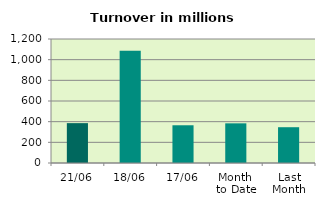
| Category | Series 0 |
|---|---|
| 21/06 | 385.791 |
| 18/06 | 1086.988 |
| 17/06 | 365.173 |
| Month 
to Date | 383.859 |
| Last
Month | 346.329 |